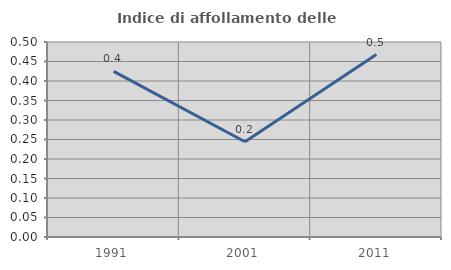
| Category | Indice di affollamento delle abitazioni  |
|---|---|
| 1991.0 | 0.425 |
| 2001.0 | 0.244 |
| 2011.0 | 0.468 |